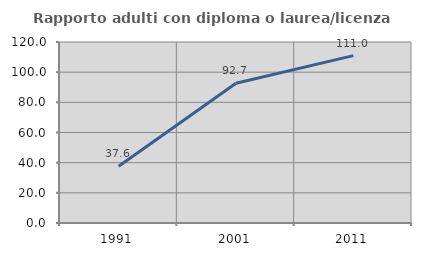
| Category | Rapporto adulti con diploma o laurea/licenza media  |
|---|---|
| 1991.0 | 37.603 |
| 2001.0 | 92.683 |
| 2011.0 | 110.97 |